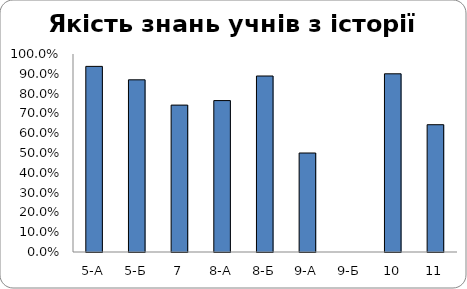
| Category | Series 0 |
|---|---|
| 5-А | 0.938 |
| 5-Б | 0.87 |
| 7 | 0.742 |
| 8-А | 0.765 |
| 8-Б | 0.889 |
| 9-А | 0.5 |
| 9-Б | 0 |
| 10 | 0.9 |
| 11 | 0.643 |